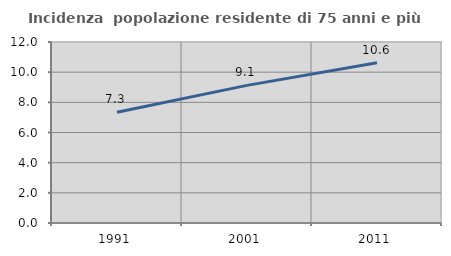
| Category | Incidenza  popolazione residente di 75 anni e più |
|---|---|
| 1991.0 | 7.339 |
| 2001.0 | 9.124 |
| 2011.0 | 10.627 |